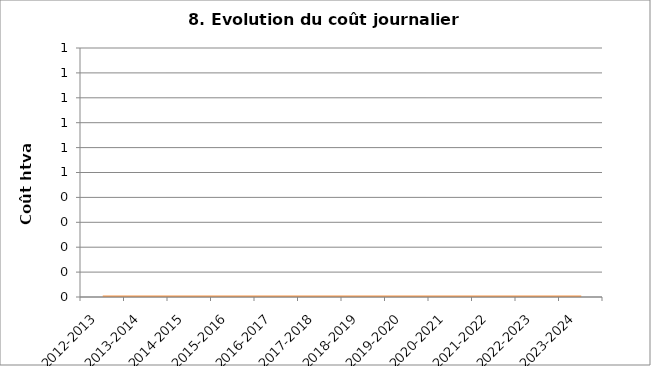
| Category | Coût journalier moyen |
|---|---|
| 2012-2013 | 0 |
| 2013-2014 | 0 |
| 2014-2015 | 0 |
| 2015-2016 | 0 |
| 2016-2017 | 0 |
| 2017-2018 | 0 |
| 2018-2019 | 0 |
| 2019-2020 | 0 |
| 2020-2021 | 0 |
| 2021-2022 | 0 |
| 2022-2023 | 0 |
| 2023-2024 | 0 |